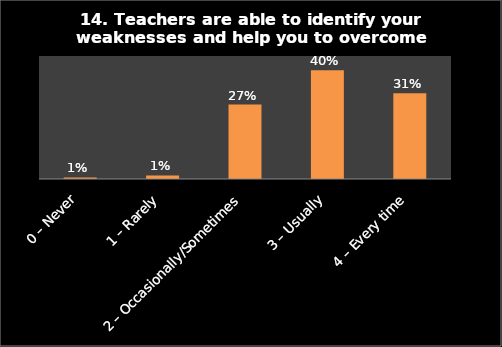
| Category | Series 0 |
|---|---|
| 0 – Never | 0.006 |
| 1 – Rarely | 0.013 |
| 2 – Occasionally/Sometimes | 0.272 |
| 3 – Usually | 0.398 |
| 4 – Every time | 0.313 |